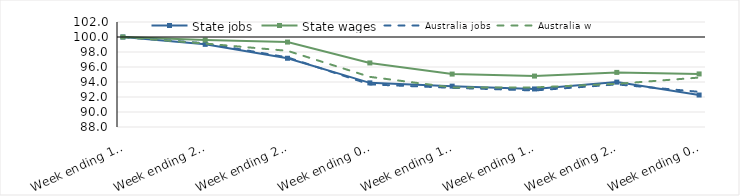
| Category | State jobs | State wages | Australia jobs | Australia wages |
|---|---|---|---|---|
| 2020-03-14 | 100 | 100 | 100 | 100 |
| 2020-03-21 | 99.019 | 99.588 | 99.165 | 99.123 |
| 2020-03-28 | 97.167 | 99.324 | 97.282 | 98.156 |
| 2020-04-04 | 93.883 | 96.542 | 93.679 | 94.686 |
| 2020-04-11 | 93.448 | 95.057 | 93.222 | 93.277 |
| 2020-04-18 | 93.074 | 94.79 | 92.871 | 93.281 |
| 2020-04-25 | 93.984 | 95.281 | 93.679 | 93.754 |
| 2020-05-02 | 92.265 | 95.076 | 92.686 | 94.591 |